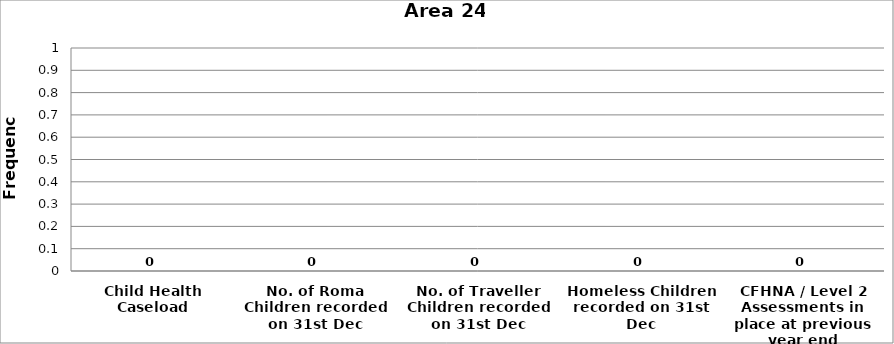
| Category | Area 24 |
|---|---|
| Child Health Caseload | 0 |
| No. of Roma Children recorded on 31st Dec | 0 |
| No. of Traveller Children recorded on 31st Dec | 0 |
| Homeless Children recorded on 31st Dec | 0 |
| CFHNA / Level 2 Assessments in place at previous year end | 0 |